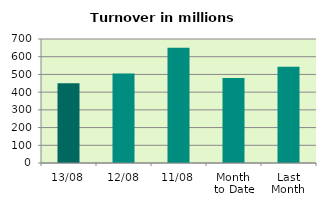
| Category | Series 0 |
|---|---|
| 13/08 | 450.879 |
| 12/08 | 505.371 |
| 11/08 | 650.684 |
| Month 
to Date | 479.205 |
| Last
Month | 542.77 |